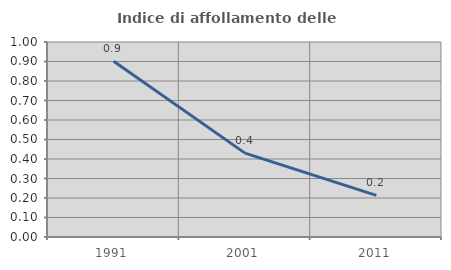
| Category | Indice di affollamento delle abitazioni  |
|---|---|
| 1991.0 | 0.901 |
| 2001.0 | 0.43 |
| 2011.0 | 0.213 |